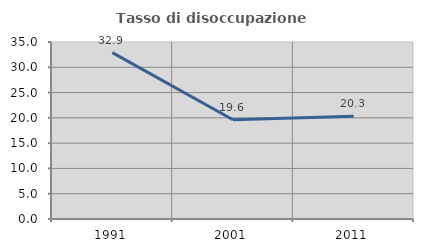
| Category | Tasso di disoccupazione giovanile  |
|---|---|
| 1991.0 | 32.899 |
| 2001.0 | 19.638 |
| 2011.0 | 20.302 |